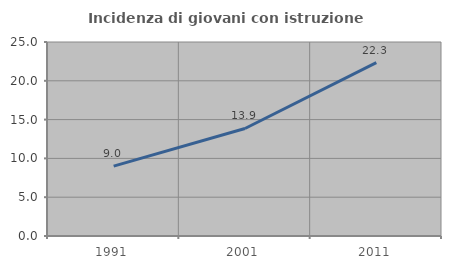
| Category | Incidenza di giovani con istruzione universitaria |
|---|---|
| 1991.0 | 9.01 |
| 2001.0 | 13.854 |
| 2011.0 | 22.336 |